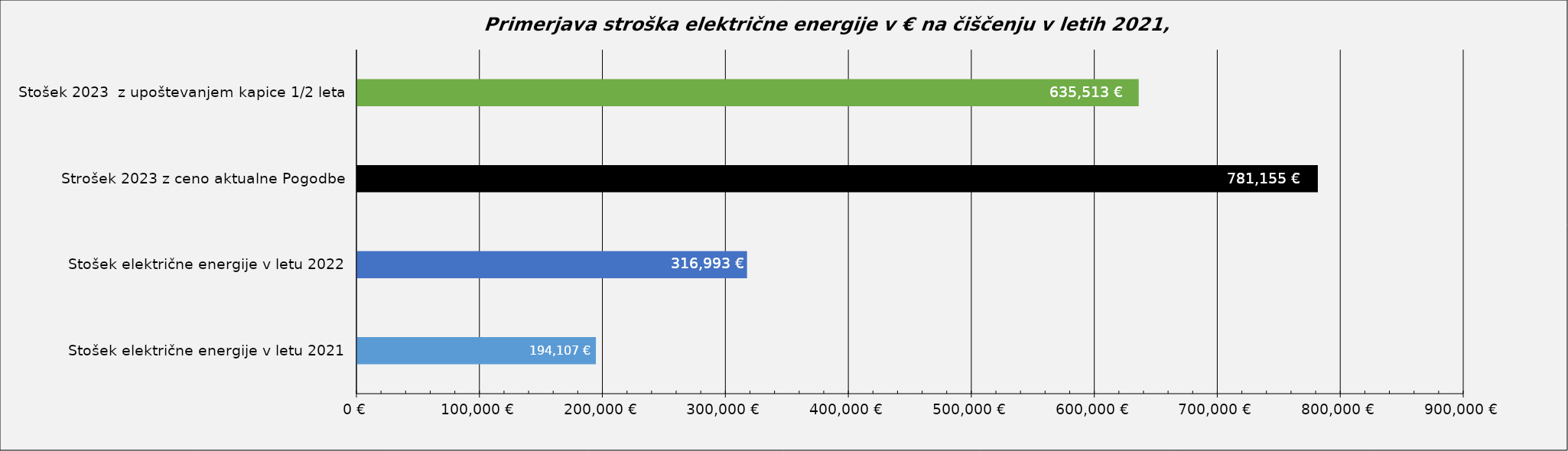
| Category | Series 0 |
|---|---|
| Stošek električne energije v letu 2021 | 194107 |
| Stošek električne energije v letu 2022 | 316992.66 |
| Strošek 2023 z ceno aktualne Pogodbe | 781154.971 |
| Stošek 2023  z upoštevanjem kapice 1/2 leta | 635512.843 |